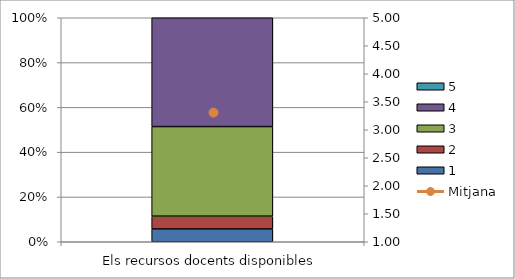
| Category | 1 | 2 | 3 | 4 | 5 |
|---|---|---|---|---|---|
| Els recursos docents disponibles | 2 | 2 | 14 | 17 | 0 |